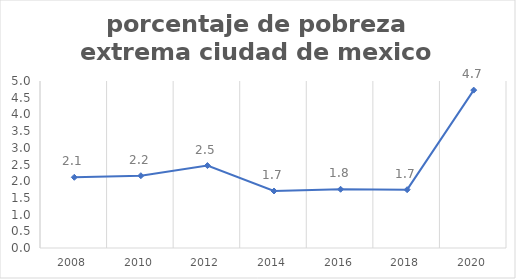
| Category | Series 0 |
|---|---|
| 2008.0 | 2.117 |
| 2010.0 | 2.164 |
| 2012.0 | 2.468 |
| 2014.0 | 1.707 |
| 2016.0 | 1.758 |
| 2018.0 | 1.746 |
| 2020.0 | 4.727 |